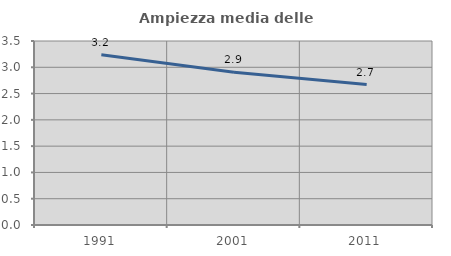
| Category | Ampiezza media delle famiglie |
|---|---|
| 1991.0 | 3.237 |
| 2001.0 | 2.907 |
| 2011.0 | 2.671 |